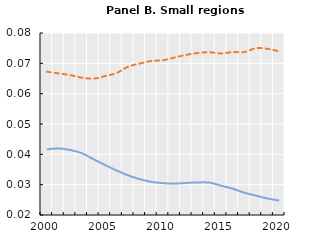
| Category | Inequality within countries | Inequality between countries |
|---|---|---|
| 2000.0 | 0.067 | 0.042 |
| nan | 0.067 | 0.042 |
| nan | 0.066 | 0.041 |
| nan | 0.065 | 0.04 |
| nan | 0.065 | 0.038 |
| 2005.0 | 0.066 | 0.037 |
| nan | 0.067 | 0.035 |
| nan | 0.069 | 0.033 |
| nan | 0.07 | 0.032 |
| nan | 0.071 | 0.031 |
| 2010.0 | 0.071 | 0.03 |
| nan | 0.072 | 0.03 |
| nan | 0.073 | 0.031 |
| nan | 0.073 | 0.031 |
| nan | 0.074 | 0.031 |
| 2015.0 | 0.073 | 0.03 |
| nan | 0.074 | 0.029 |
| nan | 0.074 | 0.027 |
| nan | 0.075 | 0.026 |
| nan | 0.075 | 0.025 |
| 2020.0 | 0.074 | 0.025 |